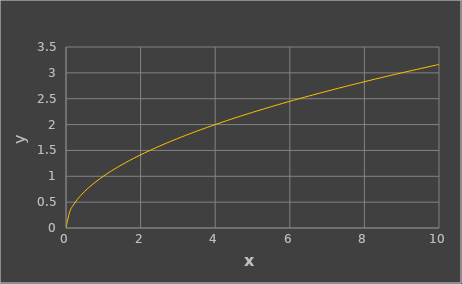
| Category | y |
|---|---|
| 0.0 | 0 |
| 0.1 | 0.316 |
| 0.2 | 0.447 |
| 0.3 | 0.548 |
| 0.4 | 0.632 |
| 0.5 | 0.707 |
| 0.6 | 0.775 |
| 0.7 | 0.837 |
| 0.8 | 0.894 |
| 0.9 | 0.949 |
| 1.0 | 1 |
| 1.1 | 1.049 |
| 1.2 | 1.095 |
| 1.3 | 1.14 |
| 1.4 | 1.183 |
| 1.5 | 1.225 |
| 1.6 | 1.265 |
| 1.7 | 1.304 |
| 1.8 | 1.342 |
| 1.9 | 1.378 |
| 2.0 | 1.414 |
| 2.1 | 1.449 |
| 2.2 | 1.483 |
| 2.3 | 1.517 |
| 2.4 | 1.549 |
| 2.5 | 1.581 |
| 2.6 | 1.612 |
| 2.7 | 1.643 |
| 2.8 | 1.673 |
| 2.9 | 1.703 |
| 3.0 | 1.732 |
| 3.1 | 1.761 |
| 3.2 | 1.789 |
| 3.3 | 1.817 |
| 3.4 | 1.844 |
| 3.5 | 1.871 |
| 3.6 | 1.897 |
| 3.7 | 1.924 |
| 3.8 | 1.949 |
| 3.9 | 1.975 |
| 4.0 | 2 |
| 4.1 | 2.025 |
| 4.2 | 2.049 |
| 4.3 | 2.074 |
| 4.4 | 2.098 |
| 4.5 | 2.121 |
| 4.6 | 2.145 |
| 4.7 | 2.168 |
| 4.8 | 2.191 |
| 4.9 | 2.214 |
| 5.0 | 2.236 |
| 5.1 | 2.258 |
| 5.2 | 2.28 |
| 5.3 | 2.302 |
| 5.4 | 2.324 |
| 5.5 | 2.345 |
| 5.6 | 2.366 |
| 5.7 | 2.387 |
| 5.8 | 2.408 |
| 5.9 | 2.429 |
| 6.0 | 2.449 |
| 6.1 | 2.47 |
| 6.2 | 2.49 |
| 6.3 | 2.51 |
| 6.4 | 2.53 |
| 6.5 | 2.55 |
| 6.6 | 2.569 |
| 6.7 | 2.588 |
| 6.8 | 2.608 |
| 6.9 | 2.627 |
| 7.0 | 2.646 |
| 7.1 | 2.665 |
| 7.2 | 2.683 |
| 7.3 | 2.702 |
| 7.4 | 2.72 |
| 7.5 | 2.739 |
| 7.6 | 2.757 |
| 7.7 | 2.775 |
| 7.8 | 2.793 |
| 7.9 | 2.811 |
| 8.0 | 2.828 |
| 8.1 | 2.846 |
| 8.2 | 2.864 |
| 8.3 | 2.881 |
| 8.4 | 2.898 |
| 8.5 | 2.915 |
| 8.6 | 2.933 |
| 8.7 | 2.95 |
| 8.8 | 2.966 |
| 8.9 | 2.983 |
| 9.0 | 3 |
| 9.1 | 3.017 |
| 9.2 | 3.033 |
| 9.3 | 3.05 |
| 9.4 | 3.066 |
| 9.5 | 3.082 |
| 9.6 | 3.098 |
| 9.7 | 3.114 |
| 9.8 | 3.13 |
| 9.9 | 3.146 |
| 10.0 | 3.162 |